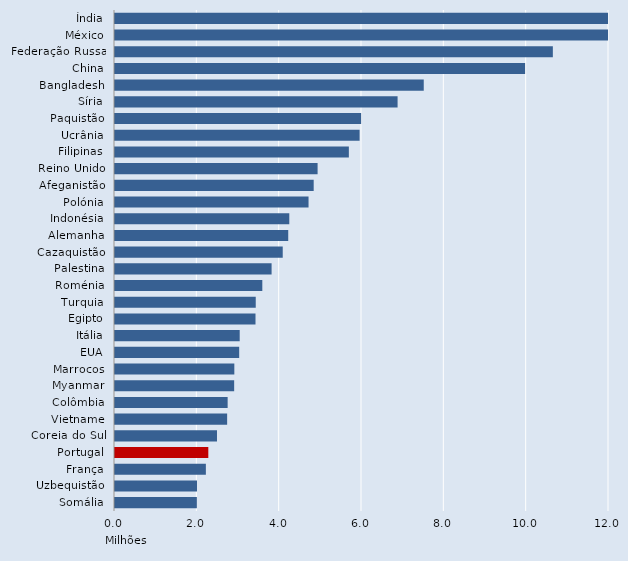
| Category | Series 0 |
|---|---|
| Índia | 16.588 |
| México | 12.965 |
| Federação Russa | 10.636 |
| China | 9.962 |
| Bangladesh | 7.5 |
| Síria | 6.864 |
| Paquistão | 5.979 |
| Ucrânia | 5.942 |
| Filipinas | 5.681 |
| Reino Unido | 4.921 |
| Afeganistão | 4.826 |
| Polónia | 4.701 |
| Indonésia | 4.234 |
| Alemanha | 4.208 |
| Cazaquistão | 4.074 |
| Palestina | 3.804 |
| Roménia | 3.579 |
| Turquia | 3.419 |
| Egipto | 3.413 |
| Itália | 3.029 |
| EUA | 3.017 |
| Marrocos | 2.899 |
| Myanmar | 2.895 |
| Colômbia | 2.736 |
| Vietname | 2.724 |
| Coreia do Sul | 2.478 |
| Portugal | 2.267 |
| França | 2.207 |
| Uzbequistão | 1.992 |
| Somália | 1.988 |